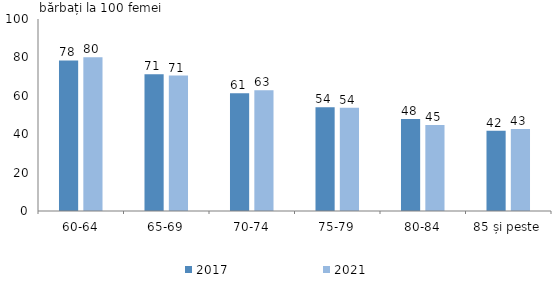
| Category | 2017 | 2021 |
|---|---|---|
| 60-64 | 78.388 | 80.023 |
| 65-69 | 71.289 | 70.533 |
| 70-74 | 61.3 | 62.862 |
| 75-79 | 53.979 | 53.711 |
| 80-84 | 47.931 | 44.826 |
| 85 și peste | 41.84 | 42.766 |